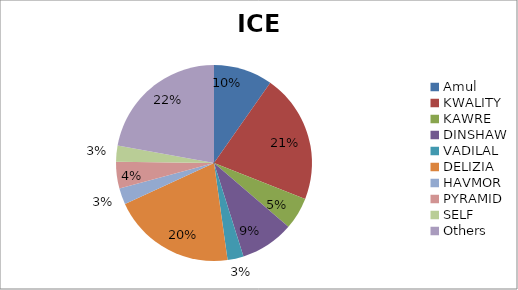
| Category | Series 0 |
|---|---|
| Amul | 11 |
| KWALITY | 24 |
| KAWRE | 6 |
| DINSHAW | 10 |
| VADILAL | 3 |
| DELIZIA | 23 |
| HAVMOR | 3 |
| PYRAMID | 5 |
| SELF | 3 |
| Others | 25 |